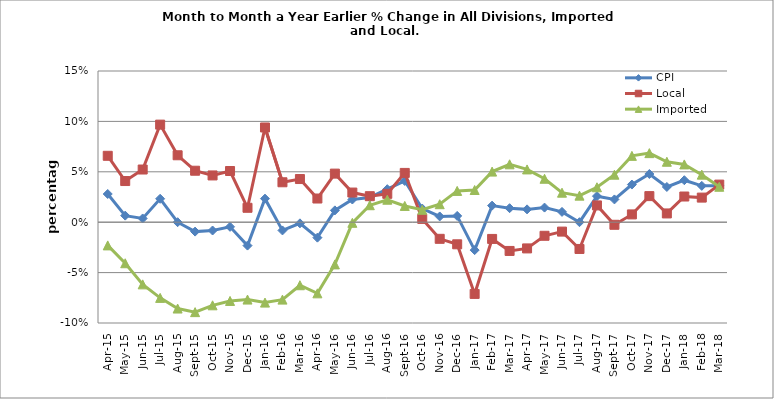
| Category | CPI | Local | Imported |
|---|---|---|---|
| 2015-04-02 | 0.028 | 0.066 | -0.023 |
| 2015-05-01 | 0.007 | 0.041 | -0.041 |
| 2015-06-01 | 0.004 | 0.052 | -0.062 |
| 2015-07-01 | 0.023 | 0.097 | -0.075 |
| 2015-08-01 | 0 | 0.066 | -0.086 |
| 2015-09-01 | -0.009 | 0.051 | -0.089 |
| 2015-10-01 | -0.008 | 0.046 | -0.082 |
| 2015-11-01 | -0.005 | 0.051 | -0.078 |
| 2015-12-01 | -0.023 | 0.014 | -0.077 |
| 2016-01-01 | 0.023 | 0.094 | -0.08 |
| 2016-02-01 | -0.008 | 0.04 | -0.077 |
| 2016-03-01 | -0.001 | 0.043 | -0.063 |
| 2016-04-01 | -0.015 | 0.023 | -0.071 |
| 2016-05-01 | 0.012 | 0.048 | -0.042 |
| 2016-06-01 | 0.023 | 0.029 | -0.001 |
| 2016-07-01 | 0.025 | 0.026 | 0.017 |
| 2016-08-01 | 0.033 | 0.028 | 0.022 |
| 2016-09-01 | 0.041 | 0.049 | 0.016 |
| 2016-10-01 | 0.014 | 0.003 | 0.012 |
| 2016-11-01 | 0.006 | -0.016 | 0.018 |
| 2016-12-01 | 0.006 | -0.022 | 0.031 |
| 2017-01-01 | -0.028 | -0.071 | 0.032 |
| 2017-02-01 | 0.016 | -0.017 | 0.05 |
| 2017-03-01 | 0.014 | -0.029 | 0.057 |
| 2017-04-01 | 0.013 | -0.026 | 0.052 |
| 2017-05-01 | 0.015 | -0.013 | 0.043 |
| 2017-06-01 | 0.01 | -0.009 | 0.029 |
| 2017-07-01 | 0 | -0.027 | 0.026 |
| 2017-08-01 | 0.026 | 0.017 | 0.035 |
| 2017-09-01 | 0.023 | -0.003 | 0.047 |
| 2017-10-01 | 0.037 | 0.008 | 0.066 |
| 2017-11-01 | 0.048 | 0.026 | 0.069 |
| 2017-12-01 | 0.035 | 0.009 | 0.06 |
| 2018-01-01 | 0.042 | 0.025 | 0.057 |
| 2018-02-01 | 0.036 | 0.024 | 0.047 |
| 2018-03-01 | 0.036 | 0.037 | 0.035 |